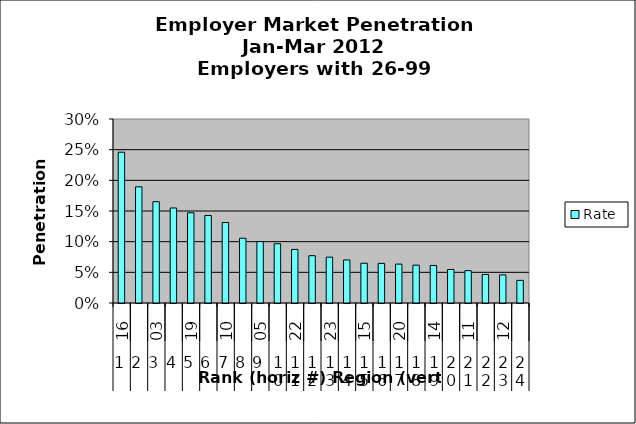
| Category | Rate |
|---|---|
| 0 | 0.246 |
| 1 | 0.189 |
| 2 | 0.165 |
| 3 | 0.155 |
| 4 | 0.147 |
| 5 | 0.143 |
| 6 | 0.131 |
| 7 | 0.106 |
| 8 | 0.1 |
| 9 | 0.097 |
| 10 | 0.087 |
| 11 | 0.077 |
| 12 | 0.075 |
| 13 | 0.07 |
| 14 | 0.065 |
| 15 | 0.065 |
| 16 | 0.063 |
| 17 | 0.062 |
| 18 | 0.061 |
| 19 | 0.055 |
| 20 | 0.053 |
| 21 | 0.046 |
| 22 | 0.046 |
| 23 | 0.037 |